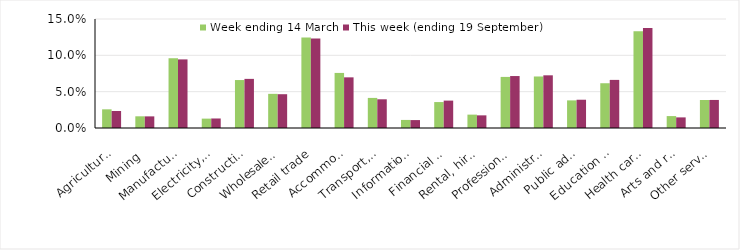
| Category | Week ending 14 March | This week (ending 19 September) |
|---|---|---|
| Agriculture, forestry and fishing | 0.026 | 0.023 |
| Mining | 0.016 | 0.016 |
| Manufacturing | 0.096 | 0.094 |
| Electricity, gas, water and waste services | 0.013 | 0.013 |
| Construction | 0.066 | 0.068 |
| Wholesale trade | 0.047 | 0.046 |
| Retail trade | 0.124 | 0.123 |
| Accommodation and food services | 0.076 | 0.07 |
| Transport, postal and warehousing | 0.041 | 0.04 |
| Information media and telecommunications | 0.011 | 0.011 |
| Financial and insurance services | 0.036 | 0.038 |
| Rental, hiring and real estate services | 0.018 | 0.017 |
| Professional, scientific and technical services | 0.07 | 0.072 |
| Administrative and support services | 0.071 | 0.072 |
| Public administration and safety | 0.038 | 0.039 |
| Education and training | 0.062 | 0.066 |
| Health care and social assistance | 0.133 | 0.138 |
| Arts and recreation services | 0.016 | 0.015 |
| Other services | 0.038 | 0.039 |